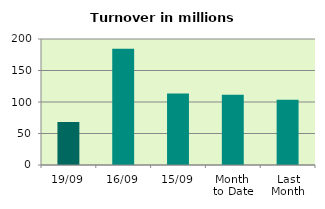
| Category | Series 0 |
|---|---|
| 19/09 | 68.388 |
| 16/09 | 184.655 |
| 15/09 | 113.564 |
| Month 
to Date | 111.618 |
| Last
Month | 103.765 |